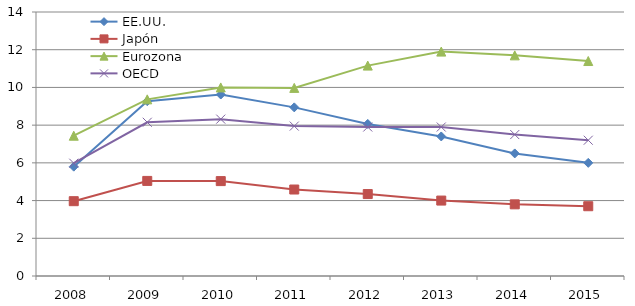
| Category | EE.UU. | Japón | Eurozona | OECD |
|---|---|---|---|---|
| 2008.0 | 5.798 | 3.968 | 7.439 | 5.981 |
| 2009.0 | 9.271 | 5.042 | 9.368 | 8.153 |
| 2010.0 | 9.624 | 5.032 | 10 | 8.319 |
| 2011.0 | 8.942 | 4.586 | 9.976 | 7.95 |
| 2012.0 | 8.064 | 4.346 | 11.157 | 7.9 |
| 2013.0 | 7.4 | 4 | 11.9 | 7.9 |
| 2014.0 | 6.5 | 3.8 | 11.7 | 7.5 |
| 2015.0 | 6 | 3.7 | 11.4 | 7.2 |